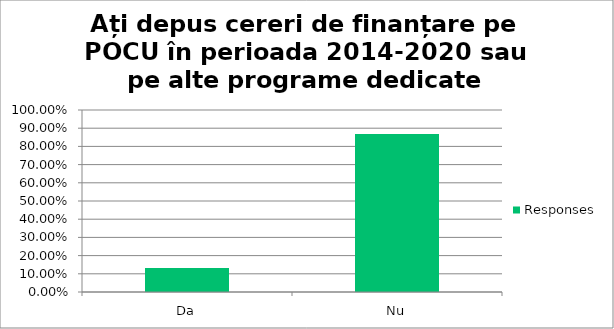
| Category | Responses |
|---|---|
| Da | 0.132 |
| Nu | 0.868 |